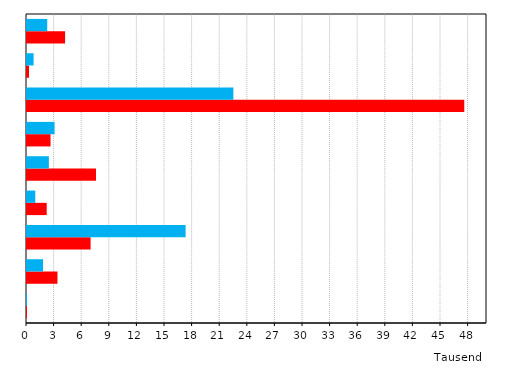
| Category | Series 0 | Series 1 |
|---|---|---|
| Außerhalb der Studien-
bereichsgliederung | 0.001 | 0.001 |
| Kunst,
Kunstwissenschaften | 3.312 | 1.744 |
| Ingenieurwissenschaften | 6.912 | 17.242 |
| Agrar-, Forst- und
Ernährungswissenschaften, Veterinärmedizin | 2.143 | 0.901 |
| Humanmedizin/
Gesundheitswissenschaften | 7.499 | 2.377 |
| Mathematik,
Naturwissenschaften | 2.557 | 2.996 |
| Rechts-, Wirtschafts-
und Sozialwissenschaften | 47.529 | 22.432 |
| Sport | 0.216 | 0.717 |
| Geisteswissenschaften | 4.14 | 2.199 |